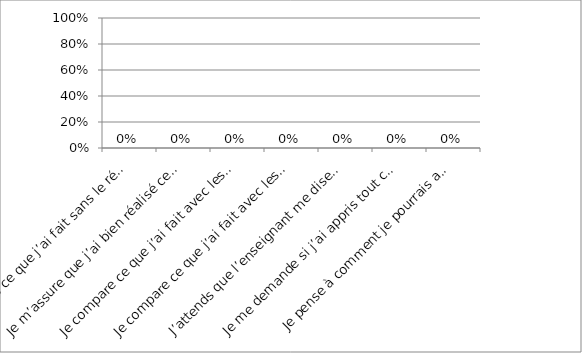
| Category | Series 0 |
|---|---|
| Je remets ce que j’ai fait sans le réviser  | 0 |
| Je m’assure que j’ai bien réalisé ce que je devais faire | 0 |
| Je compare ce que j’ai fait avec les autres élèves | 0 |
| Je compare ce que j’ai fait avec les consignes | 0 |
| J’attends que l’enseignant me dise ce qu’il pense de mon travail | 0 |
| Je me demande si j’ai appris tout ce que je devais apprendre | 0 |
| Je pense à comment je pourrais améliorer ma façon de travailler la prochaine fois | 0 |